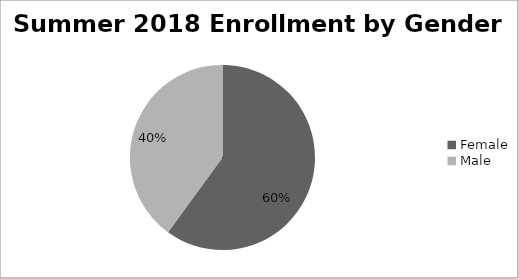
| Category | Series 0 |
|---|---|
| Female | 659 |
| Male | 439 |